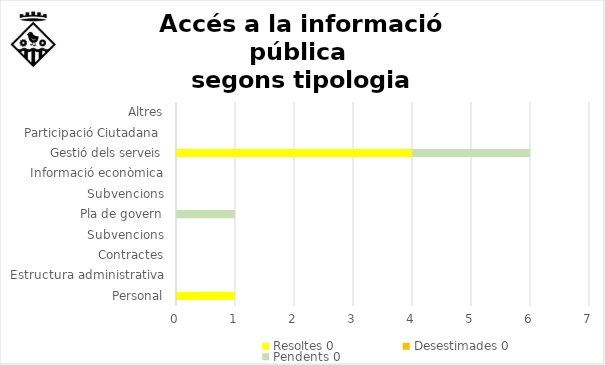
| Category | Resoltes | Desestimades | Pendents |
|---|---|---|---|
| Personal | 1 | 0 | 0 |
| Estructura administrativa | 0 | 0 | 0 |
| Contractes | 0 | 0 | 0 |
| Subvencions | 0 | 0 | 0 |
| Pla de govern | 0 | 0 | 1 |
| Subvencions | 0 | 0 | 0 |
| Informació econòmica | 0 | 0 | 0 |
| Gestió dels serveis | 4 | 0 | 2 |
| Participació Ciutadana  | 0 | 0 | 0 |
| Altres | 0 | 0 | 0 |